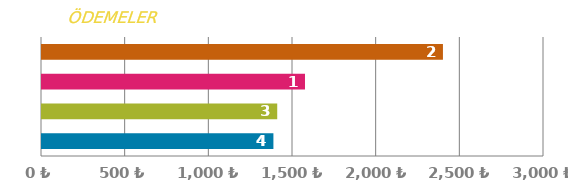
| Category | ÖDEME |
|---|---|
| 0 | 1382.921 |
| 1 | 1405.775 |
| 2 | 1571.655 |
| 3 | 2396.046 |